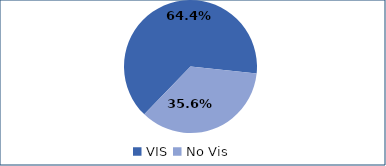
| Category | Series 0 |
|---|---|
| VIS | 0.644 |
| No Vis | 0.356 |